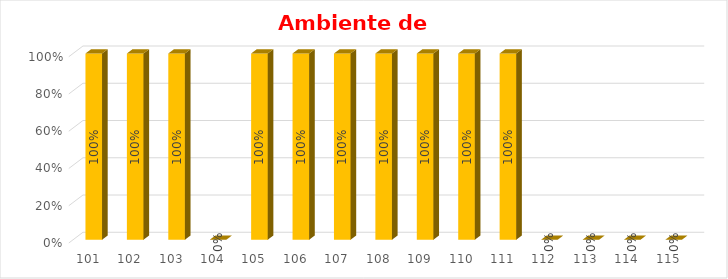
| Category | % Avance |
|---|---|
| 101.0 | 1 |
| 102.0 | 1 |
| 103.0 | 1 |
| 104.0 | 0 |
| 105.0 | 1 |
| 106.0 | 1 |
| 107.0 | 1 |
| 108.0 | 1 |
| 109.0 | 1 |
| 110.0 | 1 |
| 111.0 | 1 |
| 112.0 | 0 |
| 113.0 | 0 |
| 114.0 | 0 |
| 115.0 | 0 |